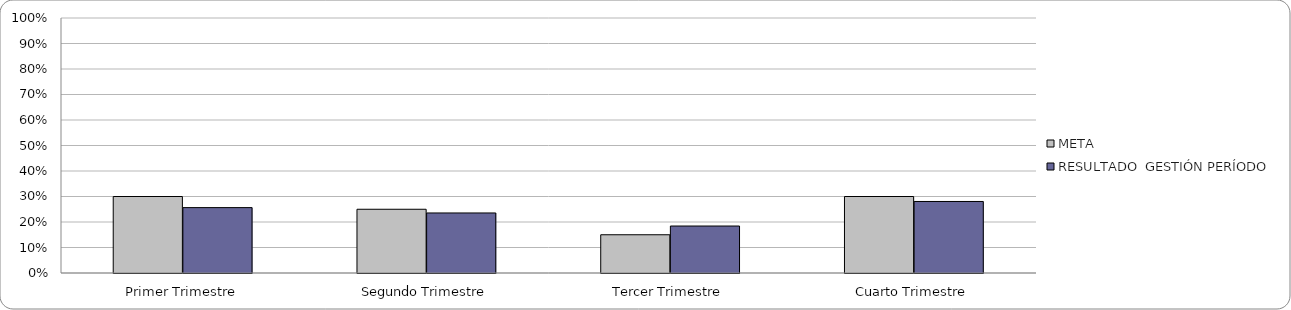
| Category | META | RESULTADO  GESTIÓN PERÍODO |
|---|---|---|
| Primer Trimestre | 0.3 | 0.256 |
| Segundo Trimestre | 0.25 | 0.235 |
| Tercer Trimestre | 0.15 | 0.184 |
| Cuarto Trimestre | 0.3 | 0.28 |